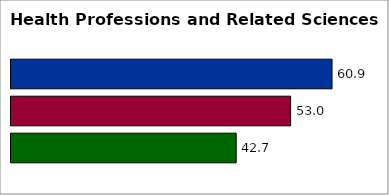
| Category | 50 states and D.C. | SREB states | State |
|---|---|---|---|
| 0 | 60.902 | 53.046 | 42.717 |